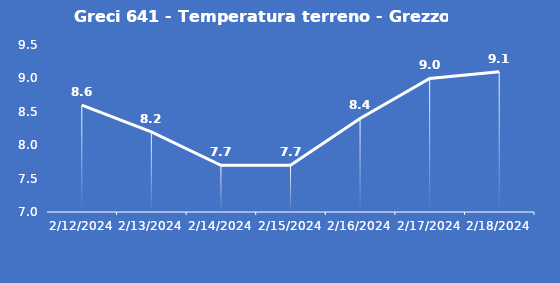
| Category | Greci 641 - Temperatura terreno - Grezzo (°C) |
|---|---|
| 2/12/24 | 8.6 |
| 2/13/24 | 8.2 |
| 2/14/24 | 7.7 |
| 2/15/24 | 7.7 |
| 2/16/24 | 8.4 |
| 2/17/24 | 9 |
| 2/18/24 | 9.1 |